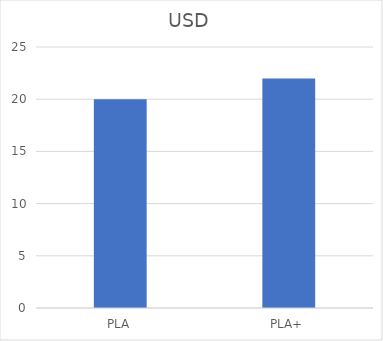
| Category | USD |
|---|---|
| PLA | 19.99 |
| PLA+ | 21.99 |